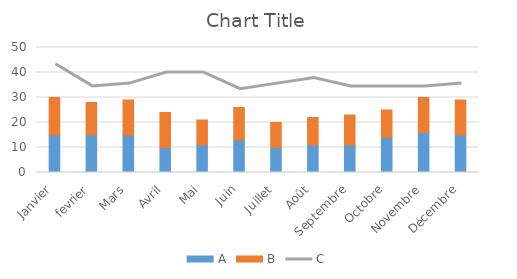
| Category | A | B |
|---|---|---|
| Janvier | 15 | 15 |
| fevrier | 15 | 13 |
| Mars | 15 | 14 |
| Avril | 10 | 14 |
| Mai | 11 | 10 |
| Juin | 13 | 13 |
| Juillet | 10 | 10 |
| Août | 11 | 11 |
| Septembre | 11 | 12 |
| Octobre | 14 | 11 |
| Novembre | 16 | 14 |
| Décembre | 15 | 14 |